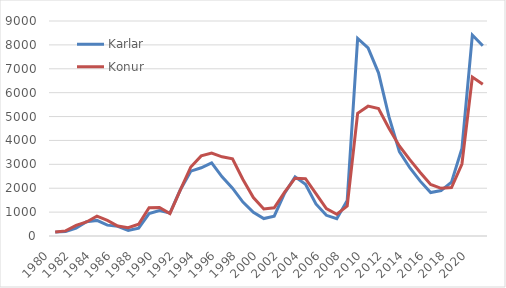
| Category | Karlar | Konur |
|---|---|---|
| 1980.0 | 162.11 | 169.201 |
| 1981.0 | 192.873 | 214.538 |
| 1982.0 | 325.791 | 443.186 |
| 1983.0 | 600.417 | 586.5 |
| 1984.0 | 652.917 | 827.75 |
| 1985.0 | 454.5 | 650.167 |
| 1986.0 | 403.917 | 418.917 |
| 1987.0 | 236.667 | 347.417 |
| 1988.0 | 324.667 | 494.917 |
| 1989.0 | 937.833 | 1187.333 |
| 1990.0 | 1063.083 | 1192.25 |
| 1991.0 | 958.583 | 941.917 |
| 1992.0 | 1934.167 | 1933.667 |
| 1993.0 | 2712.583 | 2888.833 |
| 1994.0 | 2856.583 | 3352.083 |
| 1995.0 | 3062.917 | 3475.5 |
| 1996.0 | 2476.583 | 3314.417 |
| 1997.0 | 2003 | 3227.417 |
| 1998.0 | 1421.917 | 2366.5 |
| 1999.0 | 990.083 | 1612 |
| 2000.0 | 731 | 1134 |
| 2001.0 | 830 | 1179 |
| 2002.0 | 1794 | 1837 |
| 2003.0 | 2474 | 2419 |
| 2004.0 | 2166 | 2398 |
| 2005.0 | 1343 | 1776 |
| 2006.0 | 866 | 1150 |
| 2007.0 | 721.417 | 910.833 |
| 2008.0 | 1491.333 | 1253.167 |
| 2009.0 | 8269.75 | 5137 |
| 2010.0 | 7872.917 | 5435.75 |
| 2011.0 | 6831.667 | 5335.667 |
| 2012.0 | 4996.5 | 4508.333 |
| 2013.0 | 3536 | 3768 |
| 2014.0 | 2858 | 3194.583 |
| 2015.0 | 2296.083 | 2659 |
| 2016.0 | 1820.333 | 2158.667 |
| 2017.0 | 1902.333 | 1996.667 |
| 2018.0 | 2254.833 | 2027.667 |
| 2019.0 | 3666.167 | 3014.167 |
| 2020.0 | 8412.583 | 6653.417 |
| 2021.0 | 7960.833 | 6352.25 |